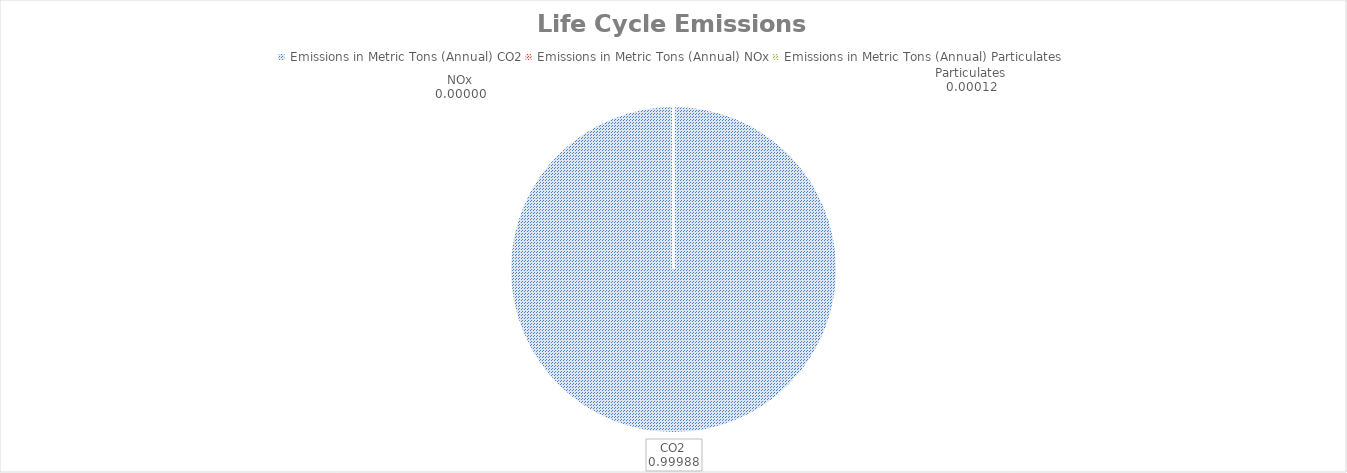
| Category | Series 0 |
|---|---|
| 0 | 483.748 |
| 1 | 0 |
| 2 | 0.06 |